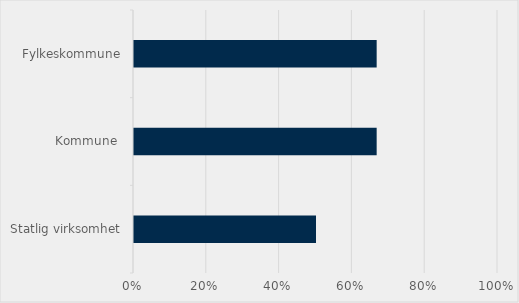
| Category | Series 0 |
|---|---|
| Statlig virksomhet | 0.5 |
| Kommune  | 0.667 |
| Fylkeskommune | 0.667 |